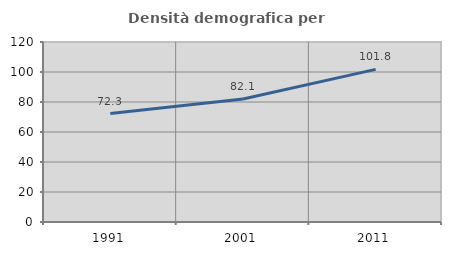
| Category | Densità demografica |
|---|---|
| 1991.0 | 72.33 |
| 2001.0 | 82.054 |
| 2011.0 | 101.768 |